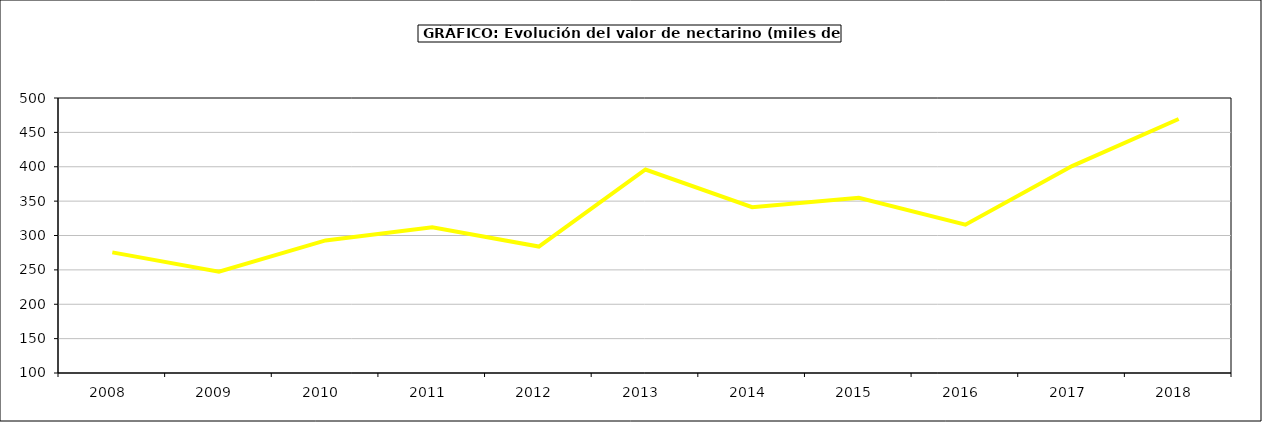
| Category | valor melocotonero |
|---|---|
| 2008.0 | 275.414 |
| 2009.0 | 247.362 |
| 2010.0 | 292.883 |
| 2011.0 | 311.892 |
| 2012.0 | 283.963 |
| 2013.0 | 395.996 |
| 2014.0 | 341.206 |
| 2015.0 | 354.8 |
| 2016.0 | 315.7 |
| 2017.0 | 400.939 |
| 2018.0 | 469.428 |